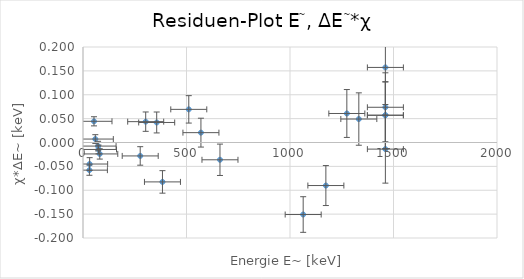
| Category | Series 0 |
|---|---|
| 32.1 | -0.045 |
| 661.7 | -0.036 |
| 1460.8 | 0.057 |
| 1173.24 | -0.09 |
| 1332.5 | 0.049 |
| 1460.8 | 0.057 |
| 59.54 | 0.007 |
| 511.0 | 0.069 |
| 1274.6 | 0.061 |
| 1460.8 | 0.074 |
| 72.8 | -0.008 |
| 74.97 | -0.015 |
| 569.7 | 0.021 |
| 1063.7 | -0.151 |
| 1460.8 | -0.014 |
| 30.9 | -0.058 |
| 53.12 | 0.044 |
| 81.0 | -0.024 |
| 276.397 | -0.028 |
| 302.851 | 0.044 |
| 356.005 | 0.042 |
| 383.851 | -0.083 |
| 1460.8 | 0.157 |